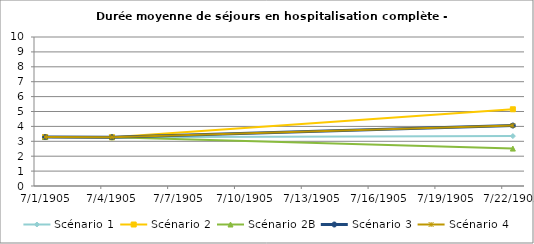
| Category | Scénario 1 | Scénario 2 | Scénario 2B | Scénario 3 | Scénario 4 |
|---|---|---|---|---|---|
| 2009.0 | 3.287 | 3.287 | 3.287 | 3.287 | 3.287 |
| 2012.0 | 3.274 | 3.274 | 3.274 | 3.274 | 3.274 |
| 2030.0 | 3.349 | 5.15 | 2.511 | 4.058 | 4.058 |